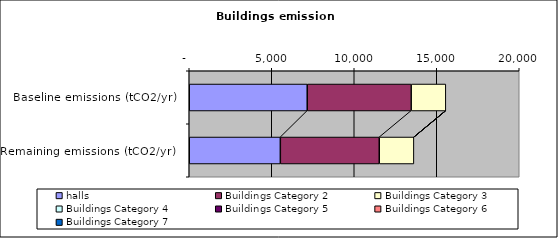
| Category |  halls  |  Buildings Category 2  |  Buildings Category 3  |  Buildings Category 4  |  Buildings Category 5  |  Buildings Category 6  |  Buildings Category 7  |
|---|---|---|---|---|---|---|---|
| Baseline emissions (tCO2/yr) | 7150.505 | 6300.992 | 2098.19 | 0 | 0 | 0 | 0 |
| Remaining emissions (tCO2/yr) | 5519.991 | 5996.071 | 2098.19 | 0 | 0 | 0 | 0 |